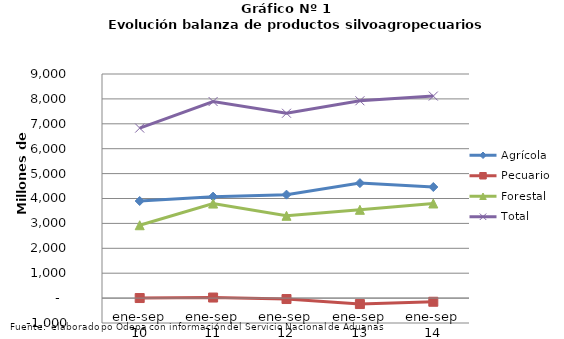
| Category | Agrícola | Pecuario | Forestal | Total |
|---|---|---|---|---|
| ene-sep 10 | 3899117 | 2548 | 2925995 | 6827660 |
| ene-sep 11 | 4075088 | 22628 | 3796664 | 7894380 |
| ene-sep 12 | 4155428 | -37598 | 3305945 | 7423775 |
| ene-sep 13 | 4617666 | -238914 | 3545708 | 7924460 |
| ene-sep 14 | 4461389 | -147029 | 3799419 | 8113779 |